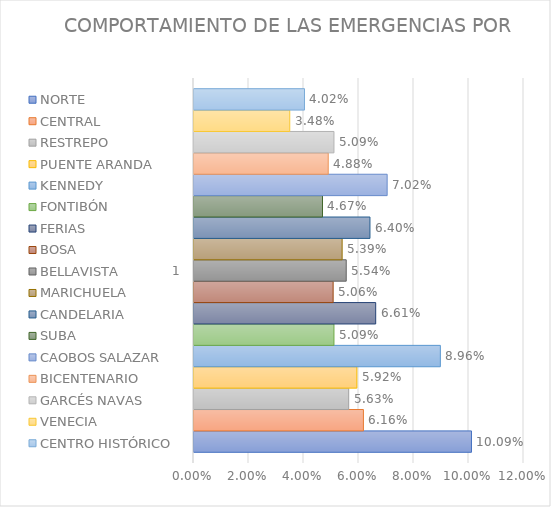
| Category | NORTE | CENTRAL | RESTREPO | PUENTE ARANDA | KENNEDY | FONTIBÓN | FERIAS | BOSA | BELLAVISTA | MARICHUELA | CANDELARIA | SUBA | CAOBOS SALAZAR | BICENTENARIO | GARCÉS NAVAS | VENECIA | CENTRO HISTÓRICO |
|---|---|---|---|---|---|---|---|---|---|---|---|---|---|---|---|---|---|
| 0 | 0.101 | 0.062 | 0.056 | 0.059 | 0.09 | 0.051 | 0.066 | 0.051 | 0.055 | 0.054 | 0.064 | 0.047 | 0.07 | 0.049 | 0.051 | 0.035 | 0.04 |